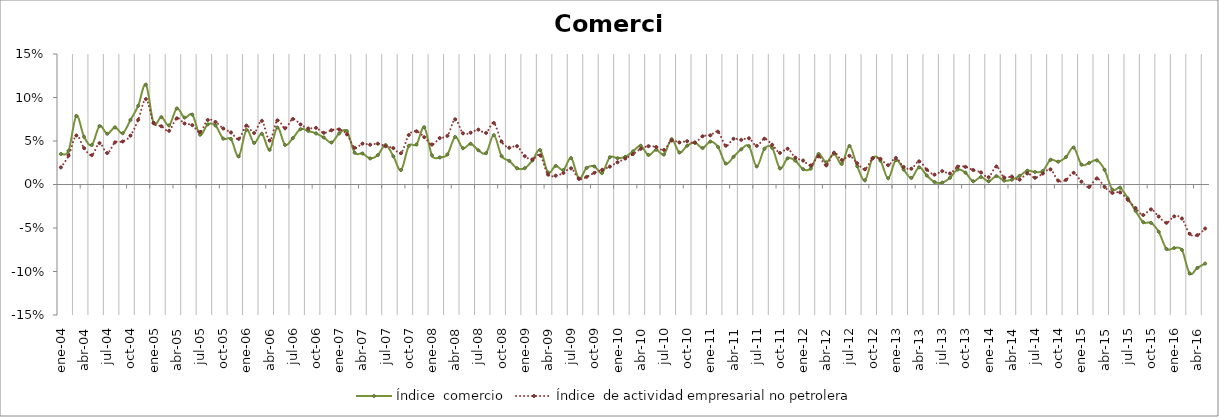
| Category | Índice  comercio | Índice  de actividad empresarial no petrolera |
|---|---|---|
| 2004-01-01 | 0.035 | 0.02 |
| 2004-02-01 | 0.039 | 0.033 |
| 2004-03-01 | 0.079 | 0.056 |
| 2004-04-01 | 0.055 | 0.042 |
| 2004-05-01 | 0.045 | 0.034 |
| 2004-06-01 | 0.067 | 0.048 |
| 2004-07-01 | 0.058 | 0.036 |
| 2004-08-01 | 0.066 | 0.048 |
| 2004-09-01 | 0.059 | 0.049 |
| 2004-10-01 | 0.074 | 0.056 |
| 2004-11-01 | 0.09 | 0.074 |
| 2004-12-01 | 0.115 | 0.098 |
| 2005-01-01 | 0.07 | 0.071 |
| 2005-02-01 | 0.077 | 0.067 |
| 2005-03-01 | 0.068 | 0.062 |
| 2005-04-01 | 0.087 | 0.076 |
| 2005-05-01 | 0.077 | 0.07 |
| 2005-06-01 | 0.08 | 0.068 |
| 2005-07-01 | 0.057 | 0.06 |
| 2005-08-01 | 0.069 | 0.074 |
| 2005-09-01 | 0.068 | 0.072 |
| 2005-10-01 | 0.053 | 0.064 |
| 2005-11-01 | 0.052 | 0.06 |
| 2005-12-01 | 0.032 | 0.052 |
| 2006-01-01 | 0.063 | 0.068 |
| 2006-02-01 | 0.048 | 0.059 |
| 2006-03-01 | 0.058 | 0.073 |
| 2006-04-01 | 0.04 | 0.051 |
| 2006-05-01 | 0.066 | 0.074 |
| 2006-06-01 | 0.045 | 0.065 |
| 2006-07-01 | 0.053 | 0.075 |
| 2006-08-01 | 0.064 | 0.069 |
| 2006-09-01 | 0.062 | 0.064 |
| 2006-10-01 | 0.059 | 0.065 |
| 2006-11-01 | 0.054 | 0.059 |
| 2006-12-01 | 0.048 | 0.062 |
| 2007-01-01 | 0.059 | 0.063 |
| 2007-02-01 | 0.061 | 0.058 |
| 2007-03-01 | 0.037 | 0.042 |
| 2007-04-01 | 0.036 | 0.047 |
| 2007-05-01 | 0.03 | 0.046 |
| 2007-06-01 | 0.034 | 0.047 |
| 2007-07-01 | 0.045 | 0.044 |
| 2007-08-01 | 0.033 | 0.042 |
| 2007-09-01 | 0.017 | 0.036 |
| 2007-10-01 | 0.044 | 0.057 |
| 2007-11-01 | 0.046 | 0.061 |
| 2007-12-01 | 0.066 | 0.054 |
| 2008-01-01 | 0.033 | 0.046 |
| 2008-02-01 | 0.031 | 0.053 |
| 2008-03-01 | 0.035 | 0.056 |
| 2008-04-01 | 0.055 | 0.075 |
| 2008-05-01 | 0.042 | 0.059 |
| 2008-06-01 | 0.047 | 0.06 |
| 2008-07-01 | 0.039 | 0.063 |
| 2008-08-01 | 0.036 | 0.059 |
| 2008-09-01 | 0.057 | 0.071 |
| 2008-10-01 | 0.033 | 0.049 |
| 2008-11-01 | 0.027 | 0.042 |
| 2008-12-01 | 0.019 | 0.044 |
| 2009-01-01 | 0.019 | 0.033 |
| 2009-02-01 | 0.028 | 0.029 |
| 2009-03-01 | 0.04 | 0.033 |
| 2009-04-01 | 0.014 | 0.012 |
| 2009-05-01 | 0.021 | 0.01 |
| 2009-06-01 | 0.017 | 0.013 |
| 2009-07-01 | 0.03 | 0.019 |
| 2009-08-01 | 0.007 | 0.006 |
| 2009-09-01 | 0.019 | 0.009 |
| 2009-10-01 | 0.021 | 0.013 |
| 2009-11-01 | 0.013 | 0.017 |
| 2009-12-01 | 0.031 | 0.02 |
| 2010-01-01 | 0.03 | 0.026 |
| 2010-02-01 | 0.032 | 0.03 |
| 2010-03-01 | 0.038 | 0.035 |
| 2010-04-01 | 0.045 | 0.041 |
| 2010-05-01 | 0.034 | 0.044 |
| 2010-06-01 | 0.04 | 0.043 |
| 2010-07-01 | 0.034 | 0.04 |
| 2010-08-01 | 0.052 | 0.051 |
| 2010-09-01 | 0.037 | 0.048 |
| 2010-10-01 | 0.045 | 0.05 |
| 2010-11-01 | 0.048 | 0.048 |
| 2010-12-01 | 0.042 | 0.055 |
| 2011-01-01 | 0.049 | 0.057 |
| 2011-02-01 | 0.043 | 0.061 |
| 2011-03-01 | 0.024 | 0.045 |
| 2011-04-01 | 0.032 | 0.053 |
| 2011-05-01 | 0.04 | 0.051 |
| 2011-06-01 | 0.044 | 0.053 |
| 2011-07-01 | 0.021 | 0.044 |
| 2011-08-01 | 0.041 | 0.053 |
| 2011-09-01 | 0.042 | 0.046 |
| 2011-10-01 | 0.019 | 0.036 |
| 2011-11-01 | 0.03 | 0.041 |
| 2011-12-01 | 0.027 | 0.031 |
| 2012-01-01 | 0.018 | 0.028 |
| 2012-02-01 | 0.018 | 0.022 |
| 2012-03-01 | 0.035 | 0.032 |
| 2012-04-01 | 0.025 | 0.022 |
| 2012-05-01 | 0.035 | 0.037 |
| 2012-06-01 | 0.024 | 0.028 |
| 2012-07-01 | 0.044 | 0.033 |
| 2012-08-01 | 0.021 | 0.024 |
| 2012-09-01 | 0.005 | 0.018 |
| 2012-10-01 | 0.03 | 0.03 |
| 2012-11-01 | 0.027 | 0.03 |
| 2012-12-01 | 0.007 | 0.022 |
| 2013-01-01 | 0.028 | 0.031 |
| 2013-02-01 | 0.017 | 0.02 |
| 2013-03-01 | 0.008 | 0.018 |
| 2013-04-01 | 0.02 | 0.027 |
| 2013-05-01 | 0.01 | 0.017 |
| 2013-06-01 | 0.003 | 0.011 |
| 2013-07-01 | 0.002 | 0.015 |
| 2013-08-01 | 0.008 | 0.013 |
| 2013-09-01 | 0.017 | 0.021 |
| 2013-10-01 | 0.014 | 0.02 |
| 2013-11-01 | 0.004 | 0.017 |
| 2013-12-01 | 0.009 | 0.014 |
| 2014-01-01 | 0.004 | 0.008 |
| 2014-02-01 | 0.01 | 0.021 |
| 2014-03-01 | 0.004 | 0.008 |
| 2014-04-01 | 0.005 | 0.009 |
| 2014-05-01 | 0.01 | 0.006 |
| 2014-06-01 | 0.016 | 0.013 |
| 2014-07-01 | 0.014 | 0.008 |
| 2014-08-01 | 0.016 | 0.013 |
| 2014-09-01 | 0.028 | 0.017 |
| 2014-10-01 | 0.026 | 0.004 |
| 2014-11-01 | 0.032 | 0.005 |
| 2014-12-01 | 0.042 | 0.013 |
| 2015-01-01 | 0.023 | 0.003 |
| 2015-02-01 | 0.025 | -0.003 |
| 2015-03-01 | 0.028 | 0.007 |
| 2015-04-01 | 0.017 | -0.003 |
| 2015-05-01 | -0.006 | -0.01 |
| 2015-06-01 | -0.004 | -0.009 |
| 2015-07-01 | -0.016 | -0.018 |
| 2015-08-01 | -0.03 | -0.027 |
| 2015-09-01 | -0.043 | -0.035 |
| 2015-10-01 | -0.044 | -0.029 |
| 2015-11-01 | -0.054 | -0.037 |
| 2015-12-01 | -0.074 | -0.044 |
| 2016-01-01 | -0.073 | -0.037 |
| 2016-02-01 | -0.075 | -0.039 |
| 2016-03-01 | -0.102 | -0.057 |
| 2016-04-01 | -0.096 | -0.058 |
| 2016-05-01 | -0.091 | -0.051 |